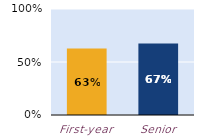
| Category | substantially |
|---|---|
| First-year | 0.628 |
| Senior | 0.674 |